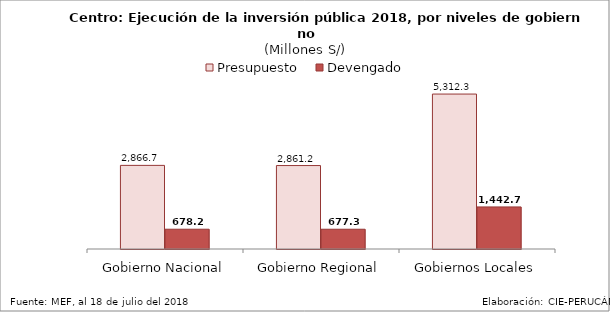
| Category | Presupuesto | Devengado |
|---|---|---|
| Gobierno Nacional | 2866.661 | 678.186 |
| Gobierno Regional | 2861.179 | 677.33 |
| Gobiernos Locales | 5312.26 | 1442.653 |